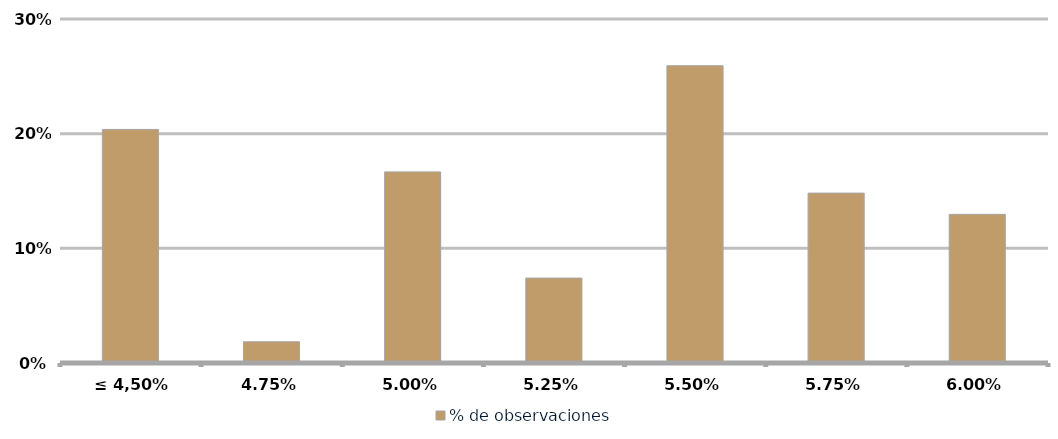
| Category | % de observaciones  |
|---|---|
| ≤ 4,50% | 0.204 |
| 4,75% | 0.019 |
| 5,00% | 0.167 |
| 5,25% | 0.074 |
| 5,50% | 0.259 |
| 5,75% | 0.148 |
| 6,00% | 0.13 |